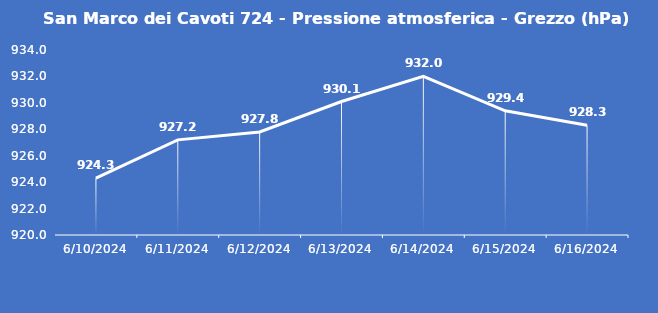
| Category | San Marco dei Cavoti 724 - Pressione atmosferica - Grezzo (hPa) |
|---|---|
| 6/10/24 | 924.3 |
| 6/11/24 | 927.2 |
| 6/12/24 | 927.8 |
| 6/13/24 | 930.1 |
| 6/14/24 | 932 |
| 6/15/24 | 929.4 |
| 6/16/24 | 928.3 |